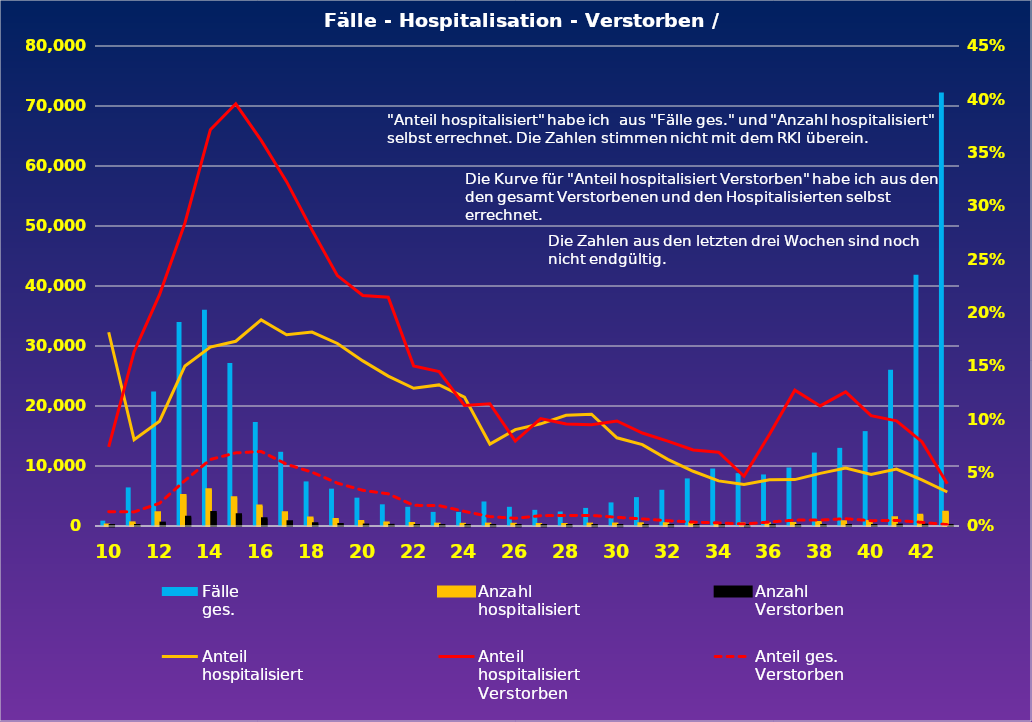
| Category | Fälle
ges. | Anzahl
hospitalisiert | Anzahl
Verstorben |
|---|---|---|---|
| 10.0 | 892 | 162 | 12 |
| 11.0 | 6431 | 520 | 85 |
| 12.0 | 22422 | 2204 | 478 |
| 13.0 | 34015 | 5104 | 1450 |
| 14.0 | 36062 | 6051 | 2248 |
| 15.0 | 27161 | 4704 | 1862 |
| 16.0 | 17336 | 3350 | 1211 |
| 17.0 | 12367 | 2218 | 716 |
| 18.0 | 7432 | 1351 | 375 |
| 19.0 | 6224 | 1065 | 250 |
| 20.0 | 4722 | 731 | 158 |
| 21.0 | 3614 | 508 | 109 |
| 22.0 | 3199 | 413 | 62 |
| 23.0 | 2351 | 311 | 45 |
| 24.0 | 2341 | 283 | 32 |
| 25.0 | 4088 | 314 | 36 |
| 26.0 | 3198 | 289 | 23 |
| 27.0 | 2693 | 258 | 26 |
| 28.0 | 2419 | 251 | 24 |
| 29.0 | 3015 | 316 | 30 |
| 30.0 | 3931 | 325 | 32 |
| 31.0 | 4812 | 367 | 32 |
| 32.0 | 6037 | 377 | 30 |
| 33.0 | 7932 | 407 | 29 |
| 34.0 | 9576 | 405 | 28 |
| 35.0 | 8803 | 343 | 16 |
| 36.0 | 8592 | 373 | 32 |
| 37.0 | 9749 | 424 | 54 |
| 38.0 | 12240 | 604 | 68 |
| 39.0 | 13021 | 708 | 89 |
| 40.0 | 15812 | 764 | 79 |
| 41.0 | 26048 | 1390 | 137 |
| 42.0 | 41867 | 1808 | 143 |
| 43.0 | 72231 | 2301 | 91 |